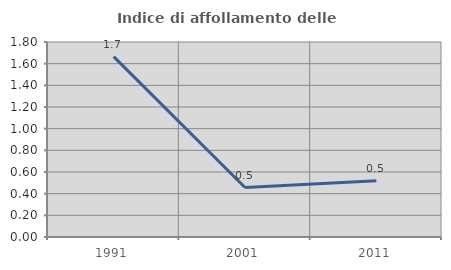
| Category | Indice di affollamento delle abitazioni  |
|---|---|
| 1991.0 | 1.665 |
| 2001.0 | 0.457 |
| 2011.0 | 0.519 |